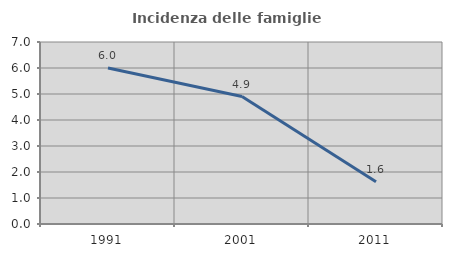
| Category | Incidenza delle famiglie numerose |
|---|---|
| 1991.0 | 6 |
| 2001.0 | 4.902 |
| 2011.0 | 1.626 |